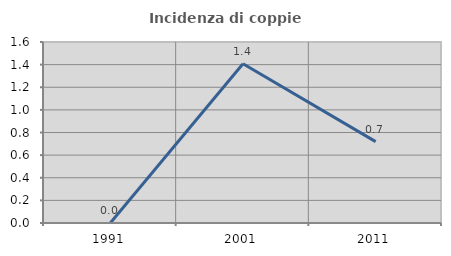
| Category | Incidenza di coppie miste |
|---|---|
| 1991.0 | 0 |
| 2001.0 | 1.408 |
| 2011.0 | 0.719 |